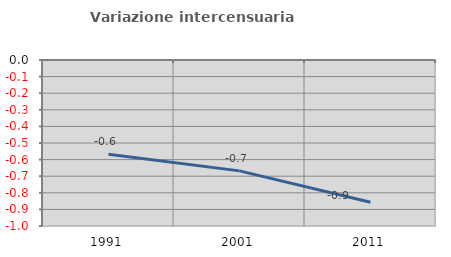
| Category | Variazione intercensuaria annua |
|---|---|
| 1991.0 | -0.568 |
| 2001.0 | -0.668 |
| 2011.0 | -0.857 |